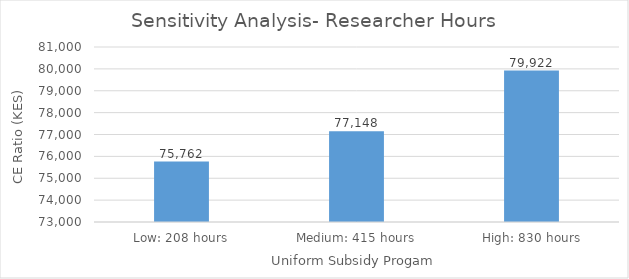
| Category | Sensitivity Analysis- Researcher Hours |
|---|---|
| Low: 208 hours | 75761.593 |
| Medium: 415 hours | 77148.247 |
| High: 830 hours | 79921.553 |